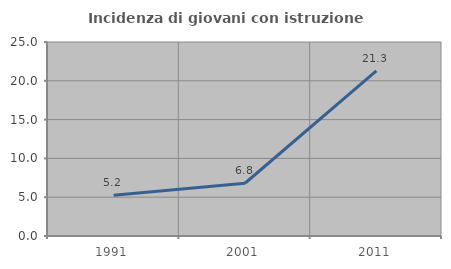
| Category | Incidenza di giovani con istruzione universitaria |
|---|---|
| 1991.0 | 5.248 |
| 2001.0 | 6.799 |
| 2011.0 | 21.283 |